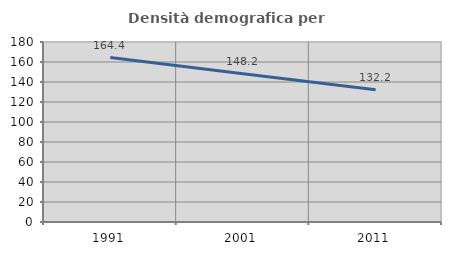
| Category | Densità demografica |
|---|---|
| 1991.0 | 164.414 |
| 2001.0 | 148.245 |
| 2011.0 | 132.211 |